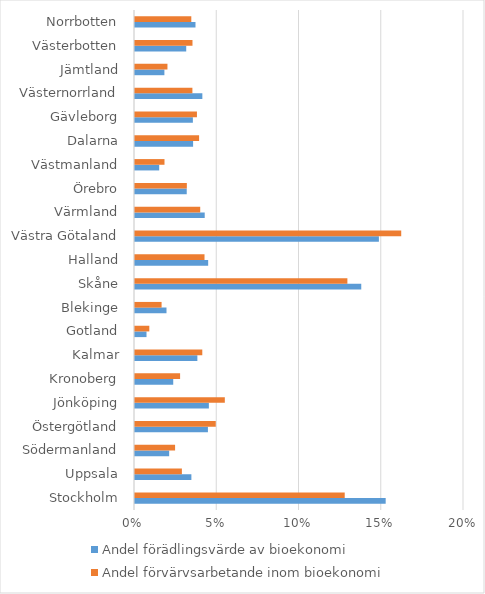
| Category | Andel förädlingsvärde av bioekonomi | Andel förvärvsarbetande inom bioekonomi |
|---|---|---|
| Stockholm | 0.152 | 0.127 |
| Uppsala | 0.034 | 0.029 |
| Södermanland | 0.021 | 0.024 |
| Östergötland | 0.044 | 0.049 |
| Jönköping | 0.045 | 0.055 |
| Kronoberg | 0.023 | 0.027 |
| Kalmar | 0.038 | 0.041 |
| Gotland | 0.007 | 0.009 |
| Blekinge | 0.019 | 0.016 |
| Skåne | 0.138 | 0.129 |
| Halland | 0.044 | 0.042 |
| Västra Götaland | 0.148 | 0.162 |
| Värmland | 0.042 | 0.04 |
| Örebro | 0.031 | 0.032 |
| Västmanland | 0.015 | 0.018 |
| Dalarna | 0.035 | 0.039 |
| Gävleborg | 0.035 | 0.038 |
| Västernorrland | 0.041 | 0.035 |
| Jämtland | 0.018 | 0.02 |
| Västerbotten | 0.031 | 0.035 |
| Norrbotten | 0.037 | 0.034 |